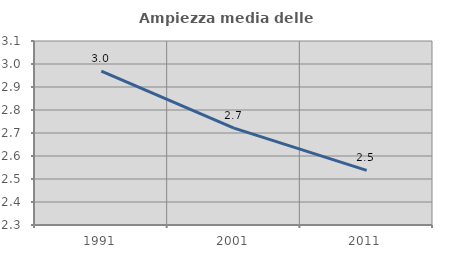
| Category | Ampiezza media delle famiglie |
|---|---|
| 1991.0 | 2.969 |
| 2001.0 | 2.721 |
| 2011.0 | 2.537 |